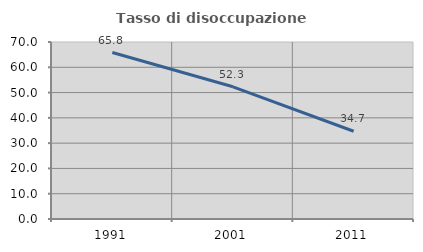
| Category | Tasso di disoccupazione giovanile  |
|---|---|
| 1991.0 | 65.843 |
| 2001.0 | 52.286 |
| 2011.0 | 34.694 |